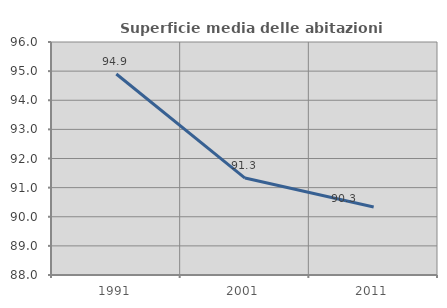
| Category | Superficie media delle abitazioni occupate |
|---|---|
| 1991.0 | 94.903 |
| 2001.0 | 91.328 |
| 2011.0 | 90.336 |